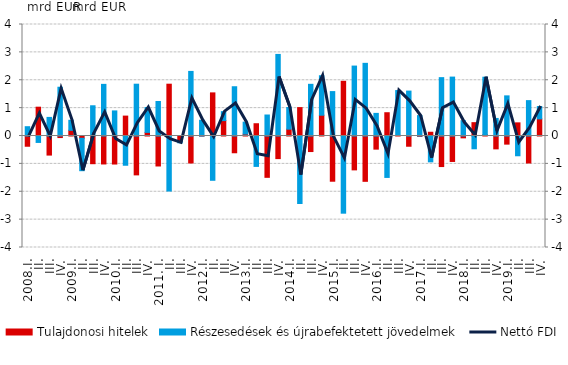
| Category | Tulajdonosi hitelek | Részesedések és újrabefektetett jövedelmek |
|---|---|---|
| 2008.I. | -0.368 | 0.334 |
| II. | 1.034 | -0.231 |
| III. | -0.685 | 0.667 |
| IV. | -0.056 | 1.75 |
| 2009.I. | 0.204 | 0.359 |
| II. | -0.082 | -1.163 |
| III. | -0.994 | 1.084 |
| IV. | -1.003 | 1.852 |
| 2010.I. | -1.006 | 0.9 |
| II. | 0.714 | -1.049 |
| III. | -1.395 | 1.858 |
| IV. | 0.13 | 0.893 |
| 2011. I. | -1.076 | 1.238 |
| II. | 1.858 | -1.975 |
| III. | -0.199 | -0.045 |
| IV. | -0.968 | 2.317 |
| 2012.I. | -0.004 | 0.564 |
| II. | 1.547 | -1.589 |
| III. | 0.553 | 0.32 |
| IV. | -0.601 | 1.767 |
| 2013.I. | 0.068 | 0.429 |
| II. | 0.44 | -1.091 |
| III. | -1.483 | 0.753 |
| IV. | -0.811 | 2.927 |
| 2014.I. | 0.246 | 0.777 |
| II. | 1.019 | -2.421 |
| III. | -0.558 | 1.854 |
| IV. | 0.746 | 1.416 |
| 2015.I. | -1.622 | 1.593 |
| II. | 1.963 | -2.769 |
| III. | -1.215 | 2.509 |
| IV. | -1.626 | 2.607 |
| 2016.I. | -0.471 | 0.811 |
| II. | 0.835 | -1.486 |
| III. | 0.022 | 1.608 |
| IV. | -0.367 | 1.611 |
| 2017.I. | -0.014 | 0.732 |
| II. | 0.134 | -0.928 |
| III. | -1.096 | 2.094 |
| IV. | -0.914 | 2.113 |
| 2018.I. | -0.066 | 0.549 |
| II. | 0.479 | -0.458 |
| III. | 0.048 | 2.061 |
| IV. | -0.461 | 0.63 |
| 2019.I. | -0.292 | 1.44 |
| II. | 0.472 | -0.709 |
| III. | -0.968 | 1.269 |
| IV. | 0.614 | 0.442 |